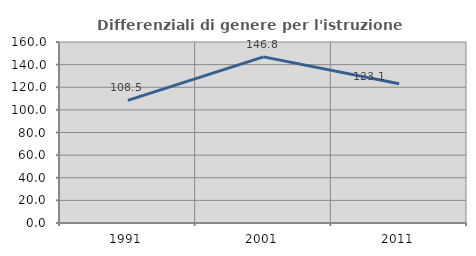
| Category | Differenziali di genere per l'istruzione superiore |
|---|---|
| 1991.0 | 108.45 |
| 2001.0 | 146.849 |
| 2011.0 | 123.137 |